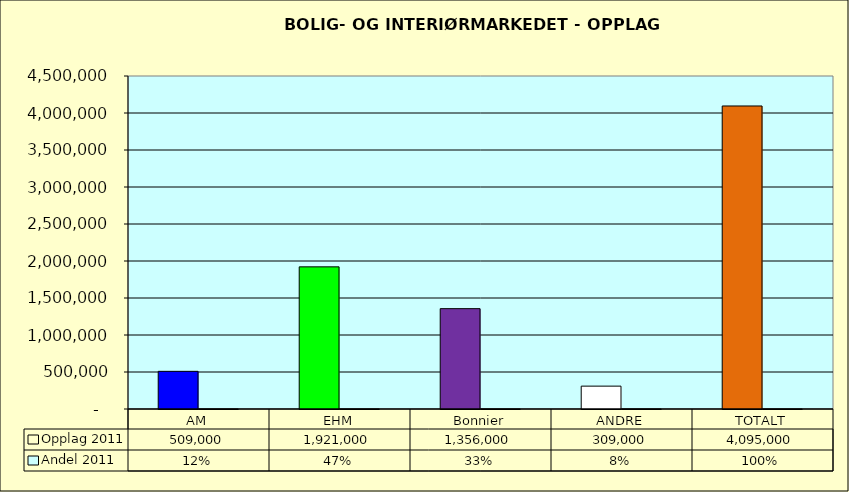
| Category | Opplag 2011 | Andel 2011 |
|---|---|---|
| AM | 509000 | 0.124 |
| EHM | 1921000 | 0.469 |
| Bonnier | 1356000 | 0.331 |
| ANDRE | 309000 | 0.075 |
| TOTALT | 4095000 | 1 |